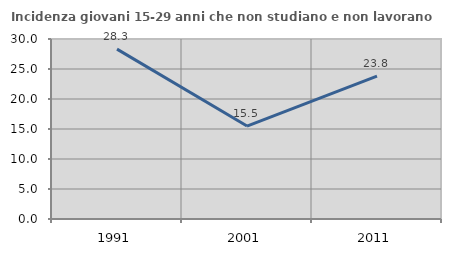
| Category | Incidenza giovani 15-29 anni che non studiano e non lavorano  |
|---|---|
| 1991.0 | 28.313 |
| 2001.0 | 15.493 |
| 2011.0 | 23.81 |